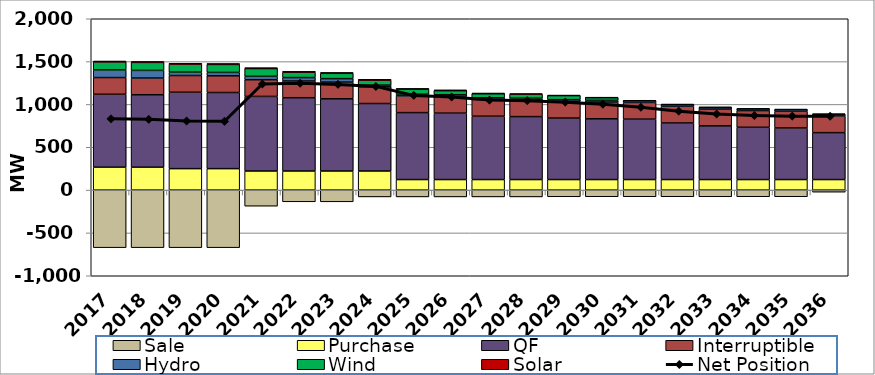
| Category | Sale | Purchase | QF | Interruptible | Hydro | Wind | Solar |
|---|---|---|---|---|---|---|---|
| 2017.0 | -672.23 | 267.45 | 851.07 | 195.04 | 89.24 | 93.34 | 10.75 |
| 2018.0 | -672.22 | 267.23 | 845.78 | 195.04 | 89.22 | 93.34 | 10.67 |
| 2019.0 | -672.22 | 250.4 | 891.9 | 195.04 | 39.38 | 93.34 | 10.6 |
| 2020.0 | -672.22 | 250.4 | 888.69 | 195.04 | 39.39 | 93.34 | 10.52 |
| 2021.0 | -187.8 | 222.84 | 870.58 | 195.04 | 39.59 | 90.69 | 10.44 |
| 2022.0 | -136.91 | 222.84 | 855.34 | 195.04 | 40.13 | 62.3 | 10.36 |
| 2023.0 | -136.92 | 222.84 | 842.61 | 195.04 | 40.25 | 62.3 | 10.27 |
| 2024.0 | -79.54 | 222.84 | 787.51 | 195.04 | 19.93 | 57.46 | 10.21 |
| 2025.0 | -79.54 | 122.82 | 781.68 | 195.04 | 19.94 | 57.46 | 10.13 |
| 2026.0 | -79.53 | 122.82 | 775.51 | 195.04 | 19.94 | 47.27 | 9.14 |
| 2027.0 | -79.54 | 122.82 | 739.67 | 195.04 | 19.94 | 47.27 | 8.27 |
| 2028.0 | -79.52 | 122.82 | 734.87 | 195.04 | 19.94 | 47.27 | 5.8 |
| 2029.0 | -78.01 | 122.82 | 717.87 | 195.04 | 19.94 | 47.27 | 4.71 |
| 2030.0 | -78 | 122.82 | 709.43 | 195.04 | 19.94 | 31.63 | 4.21 |
| 2031.0 | -77.99 | 122.82 | 705.15 | 195.04 | 19.94 | 0 | 4.01 |
| 2032.0 | -77.99 | 122.82 | 660.61 | 195.04 | 19.94 | 0 | 3.98 |
| 2033.0 | -78.01 | 122.82 | 627.25 | 195.04 | 19.94 | 0 | 3.96 |
| 2034.0 | -78 | 122.82 | 610.33 | 195.04 | 19.94 | 0 | 3.93 |
| 2035.0 | -77.99 | 122.82 | 602.14 | 195.04 | 19.94 | 0 | 3.91 |
| 2036.0 | -23.86 | 122.82 | 547.79 | 195.04 | 19.94 | 0 | 3.88 |